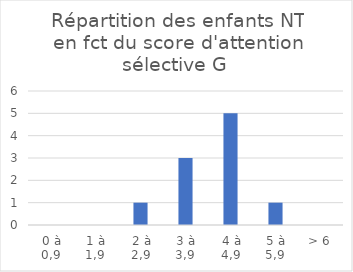
| Category | Series 0 |
|---|---|
| 0 à 0,9 | 0 |
| 1 à 1,9 | 0 |
| 2 à 2,9 | 1 |
| 3 à 3,9 | 3 |
| 4 à 4,9 | 5 |
| 5 à 5,9 | 1 |
| > 6 | 0 |